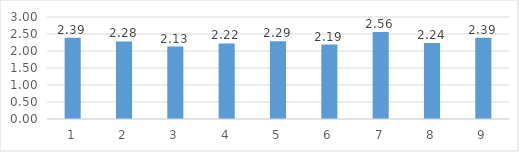
| Category | Series 0 |
|---|---|
| 0 | 2.393 |
| 1 | 2.28 |
| 2 | 2.13 |
| 3 | 2.223 |
| 4 | 2.287 |
| 5 | 2.19 |
| 6 | 2.557 |
| 7 | 2.237 |
| 8 | 2.387 |